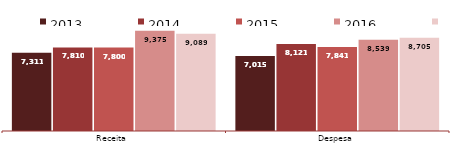
| Category | 2013 | 2014 | 2015 | 2016 | 2017 |
|---|---|---|---|---|---|
| Receita | 7311 | 7810 | 7800 | 9375 | 9089 |
| Despesa | 7015 | 8121 | 7841 | 8539 | 8705 |